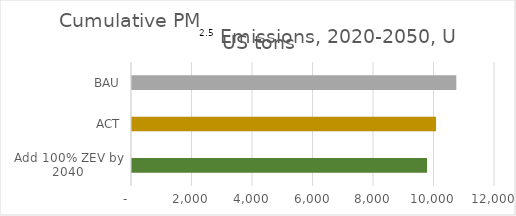
| Category | Cumulative PM2.5 Emissions, 2020-2050, US tons |
|---|---|
| Add 100% ZEV by 2040 | 9754.485 |
| ACT | 10051 |
| BAU | 10721 |